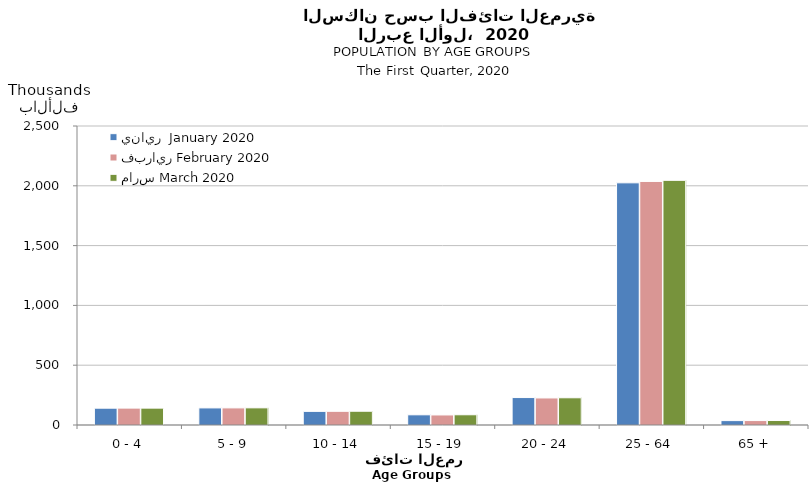
| Category | يناير  January 2020 | فبراير February 2020    | مارس March 2020   |
|---|---|---|---|
| 0 - 4 | 140474 | 141267 | 141060 |
| 5 - 9 | 142880 | 143050 | 143333 |
| 10 - 14 | 113885 | 114358 | 115061 |
| 15 - 19 | 85146 | 83978 | 85524 |
| 20 - 24 | 229448 | 226083 | 227498 |
| 25 - 64 | 2024747 | 2036334 | 2045580 |
| 65 + | 36641 | 37036 | 37428 |